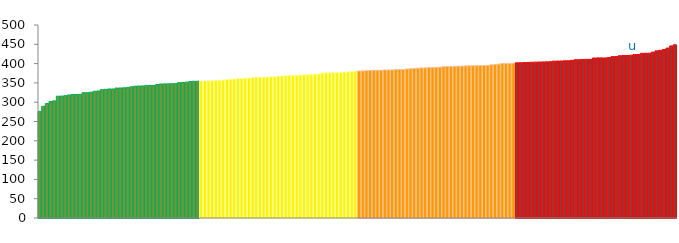
| Category | Top Quartile | 2nd Quartile | 3rd Quartile | Bottom Quartile | Series 4 |
|---|---|---|---|---|---|
|  | 276.3 | 0 | 0 | 0 | 276.3 |
|  | 289.5 | 0 | 0 | 0 | 289.5 |
|  | 296.5 | 0 | 0 | 0 | 296.5 |
|  | 301.9 | 0 | 0 | 0 | 301.9 |
|  | 303.4 | 0 | 0 | 0 | 303.4 |
|  | 315.6 | 0 | 0 | 0 | 315.6 |
|  | 315.9 | 0 | 0 | 0 | 315.9 |
|  | 316.8 | 0 | 0 | 0 | 316.8 |
|  | 318.7 | 0 | 0 | 0 | 318.7 |
|  | 320 | 0 | 0 | 0 | 320 |
|  | 320 | 0 | 0 | 0 | 320 |
|  | 320.5 | 0 | 0 | 0 | 320.5 |
|  | 324.7 | 0 | 0 | 0 | 324.7 |
|  | 324.7 | 0 | 0 | 0 | 324.7 |
|  | 326.1 | 0 | 0 | 0 | 326.1 |
|  | 328.3 | 0 | 0 | 0 | 328.3 |
|  | 329.1 | 0 | 0 | 0 | 329.1 |
|  | 332.5 | 0 | 0 | 0 | 332.5 |
|  | 333.4 | 0 | 0 | 0 | 333.4 |
|  | 334.3 | 0 | 0 | 0 | 334.3 |
|  | 334.3 | 0 | 0 | 0 | 334.3 |
|  | 336.7 | 0 | 0 | 0 | 336.7 |
|  | 336.9 | 0 | 0 | 0 | 336.9 |
|  | 337.3 | 0 | 0 | 0 | 337.3 |
|  | 337.9 | 0 | 0 | 0 | 337.9 |
|  | 339.8 | 0 | 0 | 0 | 339.8 |
|  | 341.3 | 0 | 0 | 0 | 341.3 |
|  | 342 | 0 | 0 | 0 | 342 |
|  | 342.1 | 0 | 0 | 0 | 342.1 |
|  | 342.9 | 0 | 0 | 0 | 342.9 |
|  | 343.3 | 0 | 0 | 0 | 343.3 |
|  | 343.5 | 0 | 0 | 0 | 343.5 |
|  | 345.9 | 0 | 0 | 0 | 345.9 |
|  | 347.2 | 0 | 0 | 0 | 347.2 |
|  | 347.4 | 0 | 0 | 0 | 347.4 |
|  | 347.5 | 0 | 0 | 0 | 347.5 |
|  | 347.9 | 0 | 0 | 0 | 347.9 |
|  | 348.1 | 0 | 0 | 0 | 348.1 |
|  | 350.7 | 0 | 0 | 0 | 350.7 |
|  | 351 | 0 | 0 | 0 | 351 |
|  | 352 | 0 | 0 | 0 | 352 |
|  | 353.5 | 0 | 0 | 0 | 353.5 |
|  | 354.2 | 0 | 0 | 0 | 354.2 |
|  | 354.3 | 0 | 0 | 0 | 354.3 |
|  | 0 | 354.8 | 0 | 0 | 354.8 |
|  | 0 | 355 | 0 | 0 | 355 |
|  | 0 | 355.4 | 0 | 0 | 355.4 |
|  | 0 | 355.8 | 0 | 0 | 355.8 |
|  | 0 | 356.8 | 0 | 0 | 356.8 |
|  | 0 | 356.8 | 0 | 0 | 356.8 |
|  | 0 | 357.4 | 0 | 0 | 357.4 |
|  | 0 | 358.8 | 0 | 0 | 358.8 |
|  | 0 | 359.6 | 0 | 0 | 359.6 |
|  | 0 | 360 | 0 | 0 | 360 |
|  | 0 | 361.4 | 0 | 0 | 361.4 |
|  | 0 | 361.5 | 0 | 0 | 361.5 |
|  | 0 | 362.2 | 0 | 0 | 362.2 |
|  | 0 | 362.6 | 0 | 0 | 362.6 |
|  | 0 | 363.5 | 0 | 0 | 363.5 |
|  | 0 | 364.6 | 0 | 0 | 364.6 |
|  | 0 | 364.9 | 0 | 0 | 364.9 |
|  | 0 | 364.9 | 0 | 0 | 364.9 |
|  | 0 | 365 | 0 | 0 | 365 |
|  | 0 | 365.7 | 0 | 0 | 365.7 |
|  | 0 | 366.1 | 0 | 0 | 366.1 |
|  | 0 | 367.4 | 0 | 0 | 367.4 |
|  | 0 | 368 | 0 | 0 | 368 |
|  | 0 | 368.7 | 0 | 0 | 368.7 |
|  | 0 | 369.5 | 0 | 0 | 369.5 |
|  | 0 | 369.8 | 0 | 0 | 369.8 |
|  | 0 | 369.9 | 0 | 0 | 369.9 |
|  | 0 | 370.6 | 0 | 0 | 370.6 |
|  | 0 | 370.8 | 0 | 0 | 370.8 |
|  | 0 | 371.2 | 0 | 0 | 371.2 |
|  | 0 | 372.2 | 0 | 0 | 372.2 |
|  | 0 | 372.4 | 0 | 0 | 372.4 |
|  | 0 | 373.3 | 0 | 0 | 373.3 |
|  | 0 | 375.5 | 0 | 0 | 375.5 |
|  | 0 | 376.2 | 0 | 0 | 376.2 |
|  | 0 | 376.4 | 0 | 0 | 376.4 |
|  | 0 | 376.5 | 0 | 0 | 376.5 |
|  | 0 | 377 | 0 | 0 | 377 |
|  | 0 | 377.1 | 0 | 0 | 377.1 |
|  | 0 | 378.1 | 0 | 0 | 378.1 |
|  | 0 | 378.3 | 0 | 0 | 378.3 |
|  | 0 | 379.9 | 0 | 0 | 379.9 |
|  | 0 | 380.7 | 0 | 0 | 380.7 |
|  | 0 | 0 | 380.8 | 0 | 380.8 |
|  | 0 | 0 | 381 | 0 | 381 |
|  | 0 | 0 | 381.6 | 0 | 381.6 |
|  | 0 | 0 | 382.1 | 0 | 382.1 |
|  | 0 | 0 | 382.5 | 0 | 382.5 |
|  | 0 | 0 | 382.6 | 0 | 382.6 |
|  | 0 | 0 | 382.7 | 0 | 382.7 |
|  | 0 | 0 | 383.5 | 0 | 383.5 |
|  | 0 | 0 | 383.6 | 0 | 383.6 |
|  | 0 | 0 | 383.7 | 0 | 383.7 |
|  | 0 | 0 | 384.6 | 0 | 384.6 |
|  | 0 | 0 | 384.6 | 0 | 384.6 |
|  | 0 | 0 | 384.6 | 0 | 384.6 |
|  | 0 | 0 | 386.1 | 0 | 386.1 |
|  | 0 | 0 | 386.4 | 0 | 386.4 |
|  | 0 | 0 | 387.5 | 0 | 387.5 |
|  | 0 | 0 | 388.1 | 0 | 388.1 |
|  | 0 | 0 | 388.8 | 0 | 388.8 |
|  | 0 | 0 | 388.9 | 0 | 388.9 |
|  | 0 | 0 | 389.9 | 0 | 389.9 |
|  | 0 | 0 | 390 | 0 | 390 |
|  | 0 | 0 | 390.3 | 0 | 390.3 |
|  | 0 | 0 | 390.8 | 0 | 390.8 |
|  | 0 | 0 | 392 | 0 | 392 |
|  | 0 | 0 | 392.2 | 0 | 392.2 |
|  | 0 | 0 | 392.3 | 0 | 392.3 |
|  | 0 | 0 | 392.4 | 0 | 392.4 |
|  | 0 | 0 | 393.2 | 0 | 393.2 |
|  | 0 | 0 | 393.5 | 0 | 393.5 |
|  | 0 | 0 | 394 | 0 | 394 |
|  | 0 | 0 | 394.3 | 0 | 394.3 |
|  | 0 | 0 | 394.4 | 0 | 394.4 |
|  | 0 | 0 | 394.6 | 0 | 394.6 |
|  | 0 | 0 | 394.7 | 0 | 394.7 |
|  | 0 | 0 | 395.2 | 0 | 395.2 |
|  | 0 | 0 | 395.3 | 0 | 395.3 |
|  | 0 | 0 | 396.7 | 0 | 396.7 |
|  | 0 | 0 | 397.4 | 0 | 397.4 |
|  | 0 | 0 | 398.5 | 0 | 398.5 |
|  | 0 | 0 | 400.2 | 0 | 400.2 |
|  | 0 | 0 | 400.2 | 0 | 400.2 |
|  | 0 | 0 | 400.3 | 0 | 400.3 |
|  | 0 | 0 | 400.6 | 0 | 400.6 |
|  | 0 | 0 | 0 | 402.1 | 402.1 |
|  | 0 | 0 | 0 | 402.2 | 402.2 |
|  | 0 | 0 | 0 | 402.7 | 402.7 |
|  | 0 | 0 | 0 | 403 | 403 |
|  | 0 | 0 | 0 | 403.5 | 403.5 |
|  | 0 | 0 | 0 | 403.8 | 403.8 |
|  | 0 | 0 | 0 | 404.1 | 404.1 |
|  | 0 | 0 | 0 | 404.3 | 404.3 |
|  | 0 | 0 | 0 | 404.5 | 404.5 |
|  | 0 | 0 | 0 | 404.9 | 404.9 |
|  | 0 | 0 | 0 | 406.4 | 406.4 |
|  | 0 | 0 | 0 | 406.5 | 406.5 |
|  | 0 | 0 | 0 | 406.8 | 406.8 |
|  | 0 | 0 | 0 | 407.3 | 407.3 |
|  | 0 | 0 | 0 | 407.3 | 407.3 |
|  | 0 | 0 | 0 | 408.4 | 408.4 |
|  | 0 | 0 | 0 | 410.1 | 410.1 |
|  | 0 | 0 | 0 | 410.1 | 410.1 |
|  | 0 | 0 | 0 | 410.6 | 410.6 |
|  | 0 | 0 | 0 | 411.1 | 411.1 |
|  | 0 | 0 | 0 | 411.1 | 411.1 |
|  | 0 | 0 | 0 | 414.5 | 414.5 |
|  | 0 | 0 | 0 | 414.8 | 414.8 |
|  | 0 | 0 | 0 | 414.8 | 414.8 |
|  | 0 | 0 | 0 | 414.8 | 414.8 |
|  | 0 | 0 | 0 | 415.8 | 415.8 |
|  | 0 | 0 | 0 | 418 | 418 |
|  | 0 | 0 | 0 | 418.2 | 418.2 |
|  | 0 | 0 | 0 | 420.4 | 420.4 |
|  | 0 | 0 | 0 | 420.7 | 420.7 |
|  | 0 | 0 | 0 | 420.9 | 420.9 |
|  | 0 | 0 | 0 | 421.7 | 421.7 |
| u | 0 | 0 | 0 | 423.4 | 423.4 |